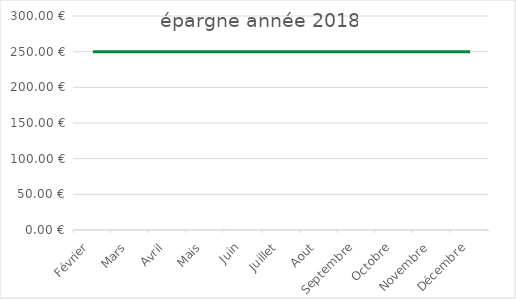
| Category | dépenses année 2017 |
|---|---|
| Février | 250 |
| Mars | 250 |
| Avril | 250 |
| Mais | 250 |
| Juin | 250 |
| Juillet | 250 |
| Aout | 250 |
| Septembre | 250 |
| Octobre | 250 |
| Novembre | 250 |
| Décembre | 250 |